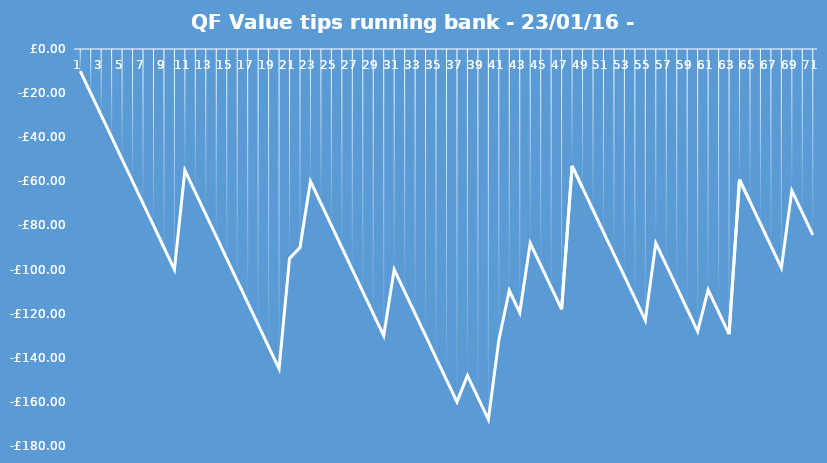
| Category | Series 0 |
|---|---|
| 0 | -10 |
| 1 | -20 |
| 2 | -30 |
| 3 | -40 |
| 4 | -50 |
| 5 | -60 |
| 6 | -70 |
| 7 | -80 |
| 8 | -90 |
| 9 | -100 |
| 10 | -55 |
| 11 | -65 |
| 12 | -75 |
| 13 | -85 |
| 14 | -95 |
| 15 | -105 |
| 16 | -115 |
| 17 | -125 |
| 18 | -135 |
| 19 | -145 |
| 20 | -95 |
| 21 | -90 |
| 22 | -60 |
| 23 | -70 |
| 24 | -80 |
| 25 | -90 |
| 26 | -100 |
| 27 | -110 |
| 28 | -120 |
| 29 | -130 |
| 30 | -100 |
| 31 | -110 |
| 32 | -120 |
| 33 | -130 |
| 34 | -140 |
| 35 | -150 |
| 36 | -160 |
| 37 | -148 |
| 38 | -158 |
| 39 | -168 |
| 40 | -132 |
| 41 | -109.5 |
| 42 | -119.5 |
| 43 | -88 |
| 44 | -98 |
| 45 | -108 |
| 46 | -118 |
| 47 | -53 |
| 48 | -63 |
| 49 | -73 |
| 50 | -83 |
| 51 | -93 |
| 52 | -103 |
| 53 | -113 |
| 54 | -123 |
| 55 | -88 |
| 56 | -98 |
| 57 | -108 |
| 58 | -118 |
| 59 | -128 |
| 60 | -109.233 |
| 61 | -119.233 |
| 62 | -129.233 |
| 63 | -59.233 |
| 64 | -69.233 |
| 65 | -79.233 |
| 66 | -89.233 |
| 67 | -99.233 |
| 68 | -64.233 |
| 69 | -74.233 |
| 70 | -84.233 |